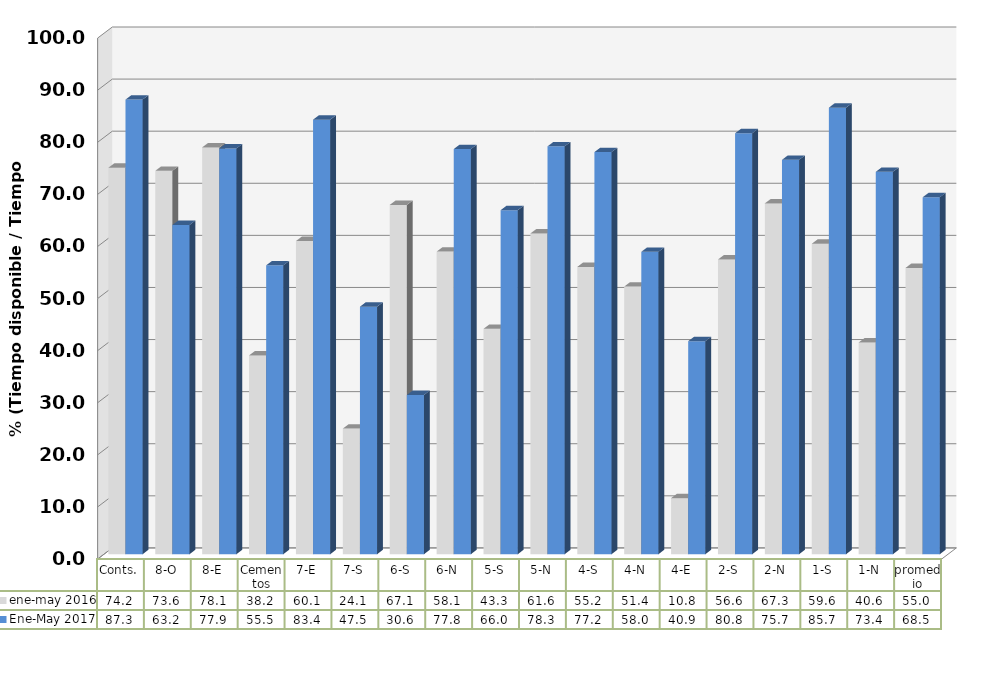
| Category | ene-may 2016 | Ene-May 2017 |
|---|---|---|
| Conts. | 74.188 | 87.273 |
| 8-O | 73.594 | 63.197 |
| 8-E | 78.09 | 77.877 |
| Cementos | 38.158 | 55.451 |
| 7-E | 60.118 | 83.418 |
| 7-S | 24.117 | 47.522 |
| 6-S | 67.054 | 30.569 |
| 6-N | 58.09 | 77.777 |
| 5-S | 43.267 | 66.045 |
| 5-N | 61.569 | 78.294 |
| 4-S | 55.157 | 77.196 |
| 4-N | 51.375 | 58.05 |
| 4-E | 10.763 | 40.894 |
| 2-S | 56.575 | 80.809 |
| 2-N | 67.347 | 75.71 |
| 1-S | 59.595 | 85.726 |
| 1-N | 40.646 | 73.406 |
| promedio | 54.963 | 68.515 |